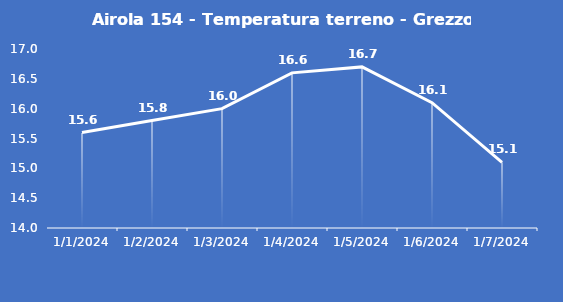
| Category | Airola 154 - Temperatura terreno - Grezzo (°C) |
|---|---|
| 1/1/24 | 15.6 |
| 1/2/24 | 15.8 |
| 1/3/24 | 16 |
| 1/4/24 | 16.6 |
| 1/5/24 | 16.7 |
| 1/6/24 | 16.1 |
| 1/7/24 | 15.1 |